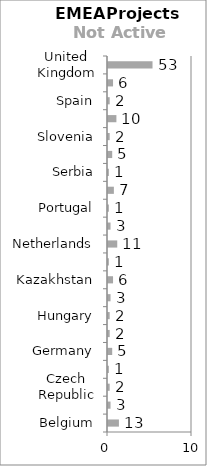
| Category | Total |
|---|---|
| Belgium | 13 |
| Croatia | 3 |
| Czech Republic | 2 |
| Denmark | 1 |
| Germany | 5 |
| Greece | 2 |
| Hungary | 2 |
| Italy | 3 |
| Kazakhstan | 6 |
| Macedonia | 1 |
| Netherlands | 11 |
| Poland | 3 |
| Portugal | 1 |
| Russia | 7 |
| Serbia | 1 |
| Slovakia | 5 |
| Slovenia | 2 |
| South Africa | 10 |
| Spain | 2 |
| Turkey | 6 |
| United Kingdom | 53 |